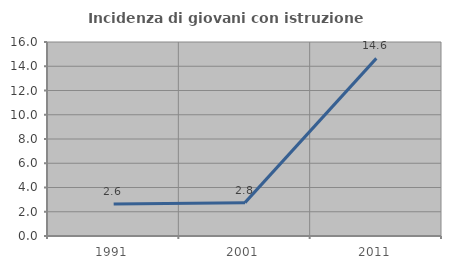
| Category | Incidenza di giovani con istruzione universitaria |
|---|---|
| 1991.0 | 2.632 |
| 2001.0 | 2.752 |
| 2011.0 | 14.65 |